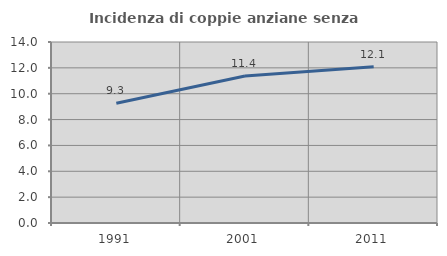
| Category | Incidenza di coppie anziane senza figli  |
|---|---|
| 1991.0 | 9.259 |
| 2001.0 | 11.377 |
| 2011.0 | 12.088 |